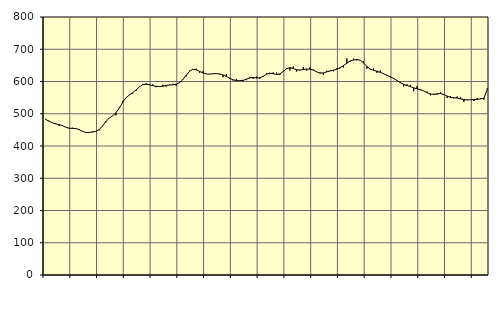
| Category | Piggar | Series 1 |
|---|---|---|
| nan | 484.3 | 482.21 |
| 87.0 | 478.1 | 477 |
| 87.0 | 471.3 | 471.91 |
| 87.0 | 470.2 | 468.63 |
| nan | 462.1 | 466.55 |
| 88.0 | 465.1 | 463.04 |
| 88.0 | 458 | 458.35 |
| 88.0 | 453.9 | 455.1 |
| nan | 456.8 | 454.6 |
| 89.0 | 455.7 | 454.3 |
| 89.0 | 452.7 | 450.87 |
| 89.0 | 444.4 | 445.42 |
| nan | 440.9 | 441.78 |
| 90.0 | 442.4 | 441.8 |
| 90.0 | 445.5 | 443.42 |
| 90.0 | 444.5 | 445.49 |
| nan | 448.5 | 451.05 |
| 91.0 | 462.4 | 462.18 |
| 91.0 | 473 | 475.91 |
| 91.0 | 486.8 | 486.66 |
| nan | 493.2 | 493.52 |
| 92.0 | 495.2 | 502.69 |
| 92.0 | 518.6 | 517.6 |
| 92.0 | 538 | 535.07 |
| nan | 548.4 | 549.22 |
| 93.0 | 559 | 558.13 |
| 93.0 | 562.6 | 565.29 |
| 93.0 | 571.8 | 573.62 |
| nan | 584.2 | 583.26 |
| 94.0 | 592 | 590.13 |
| 94.0 | 594.1 | 591.77 |
| 94.0 | 589.4 | 589.97 |
| nan | 591.7 | 587.15 |
| 95.0 | 582.3 | 585 |
| 95.0 | 584.1 | 584.28 |
| 95.0 | 590 | 585.3 |
| nan | 584.1 | 587.66 |
| 96.0 | 590.7 | 589.14 |
| 96.0 | 592.8 | 589.65 |
| 96.0 | 586.2 | 591.55 |
| nan | 597.4 | 596.36 |
| 97.0 | 605 | 606.16 |
| 97.0 | 615.8 | 619.02 |
| 97.0 | 633.2 | 631.64 |
| nan | 638.4 | 638.04 |
| 98.0 | 639.8 | 636.21 |
| 98.0 | 627.3 | 631.21 |
| 98.0 | 631.7 | 626.67 |
| nan | 623.3 | 623.71 |
| 99.0 | 622.2 | 622.95 |
| 99.0 | 625.4 | 624.21 |
| 99.0 | 623.8 | 624.46 |
| nan | 624.3 | 622.75 |
| 0.0 | 613.1 | 620.24 |
| 0.0 | 623.4 | 615.93 |
| 0.0 | 608.1 | 610.12 |
| nan | 603.1 | 605.36 |
| 1.0 | 607.3 | 603.04 |
| 1.0 | 601.8 | 602.38 |
| 1.0 | 600.8 | 603.6 |
| nan | 604.2 | 607.31 |
| 2.0 | 614.1 | 611.13 |
| 2.0 | 608.2 | 612.34 |
| 2.0 | 615.1 | 611.04 |
| nan | 608.4 | 611.57 |
| 3.0 | 614.5 | 616.06 |
| 3.0 | 626.3 | 622.74 |
| 3.0 | 623.5 | 626.14 |
| nan | 628.2 | 623.94 |
| 4.0 | 627.6 | 621.59 |
| 4.0 | 620.5 | 623.83 |
| 4.0 | 633.2 | 631.03 |
| nan | 640.3 | 639.47 |
| 5.0 | 634.1 | 643.1 |
| 5.0 | 646.3 | 640.41 |
| 5.0 | 631 | 636.49 |
| nan | 634.3 | 635.44 |
| 6.0 | 644.8 | 637.04 |
| 6.0 | 634.1 | 638.79 |
| 6.0 | 643.6 | 638.07 |
| nan | 637.1 | 635.23 |
| 7.0 | 629.3 | 630.08 |
| 7.0 | 628.1 | 625.97 |
| 7.0 | 621.3 | 626.61 |
| nan | 633.1 | 629.83 |
| 8.0 | 634.2 | 632.7 |
| 8.0 | 631.5 | 634.87 |
| 8.0 | 640.5 | 638.15 |
| nan | 640.7 | 642.96 |
| 9.0 | 643.8 | 649.15 |
| 9.0 | 671.4 | 656.53 |
| 9.0 | 664.8 | 663.24 |
| nan | 670.8 | 666.87 |
| 10.0 | 665.4 | 668.26 |
| 10.0 | 666.6 | 666.19 |
| 10.0 | 663.3 | 657.97 |
| nan | 639.7 | 646.7 |
| 11.0 | 637.2 | 638.36 |
| 11.0 | 640.8 | 634.42 |
| 11.0 | 626.9 | 631.9 |
| nan | 634.2 | 628.26 |
| 12.0 | 623.2 | 623.99 |
| 12.0 | 618.5 | 619.32 |
| 12.0 | 615.9 | 614.27 |
| nan | 610.9 | 609.64 |
| 13.0 | 601.7 | 603.19 |
| 13.0 | 598.6 | 596.06 |
| 13.0 | 584.8 | 591.29 |
| nan | 591.5 | 587.65 |
| 14.0 | 588.9 | 584.12 |
| 14.0 | 570 | 580.28 |
| 14.0 | 585.9 | 577.13 |
| nan | 572.9 | 574.88 |
| 15.0 | 570.7 | 570.68 |
| 15.0 | 568.5 | 565.36 |
| 15.0 | 557.1 | 561.27 |
| nan | 561.8 | 559.85 |
| 16.0 | 559.2 | 561.91 |
| 16.0 | 566.4 | 562.64 |
| 16.0 | 558.7 | 559.66 |
| nan | 548.5 | 554.72 |
| 17.0 | 554.6 | 550.76 |
| 17.0 | 547.7 | 549.6 |
| 17.0 | 553.4 | 548.6 |
| nan | 551.7 | 546.14 |
| 18.0 | 537.2 | 543.93 |
| 18.0 | 543.6 | 542.79 |
| 18.0 | 542.8 | 543.16 |
| nan | 539.4 | 544.09 |
| 19.0 | 548.9 | 544.59 |
| 19.0 | 547.8 | 545.94 |
| 19.0 | 543.3 | 548.6 |
| nan | 579.5 | 575.94 |